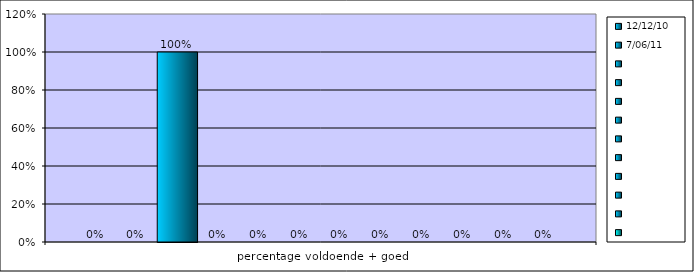
| Category | 12-12-10 | 7-06-11 | Series 2 | Series 3 | Series 4 | Series 5 | Series 6 | Series 7 | Series 8 | Series 9 | Series 10 | Series 11 |
|---|---|---|---|---|---|---|---|---|---|---|---|---|
| percentage voldoende + goed | 0 | 0 | 1 | 0 | 0 | 0 | 0 | 0 | 0 | 0 | 0 | 0 |